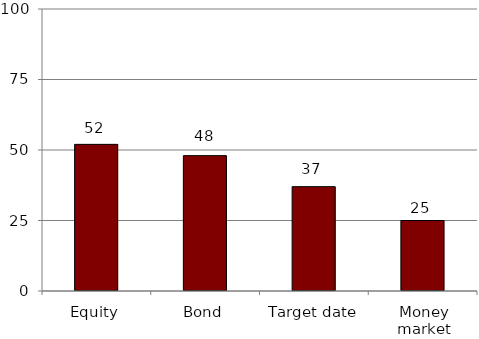
| Category | Series 0 |
|---|---|
| Equity | 52 |
| Bond | 48 |
| Target date | 37 |
| Money market | 25 |